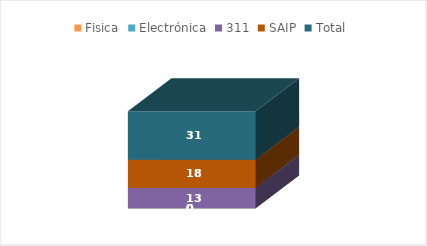
| Category | Fisica | Electrónica | 311 | SAIP | Total |
|---|---|---|---|---|---|
| 0 | 0 | 0 | 13 | 18 | 31 |